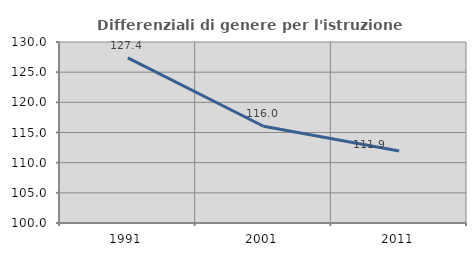
| Category | Differenziali di genere per l'istruzione superiore |
|---|---|
| 1991.0 | 127.358 |
| 2001.0 | 116.035 |
| 2011.0 | 111.933 |